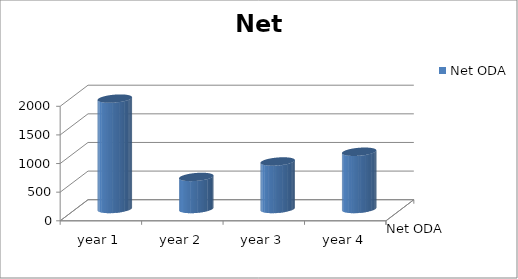
| Category | Net ODA |
|---|---|
| year 1 | 1928 |
| year 2 | 560 |
| year 3 | 830 |
| year 4 | 1000 |